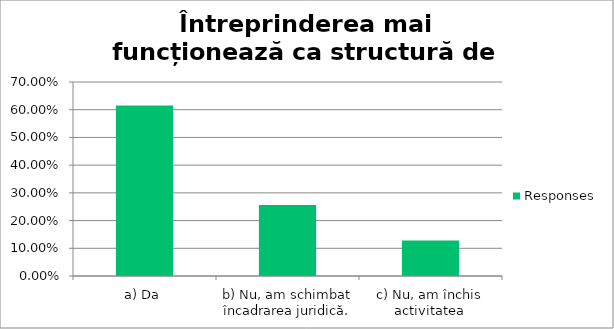
| Category | Responses |
|---|---|
| a) Da | 0.615 |
| b) Nu, am schimbat încadrarea juridică. | 0.256 |
| c) Nu, am închis activitatea | 0.128 |